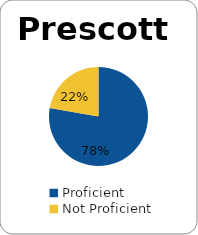
| Category | Series 0 |
|---|---|
| Proficient | 0.778 |
| Not Proficient | 0.222 |